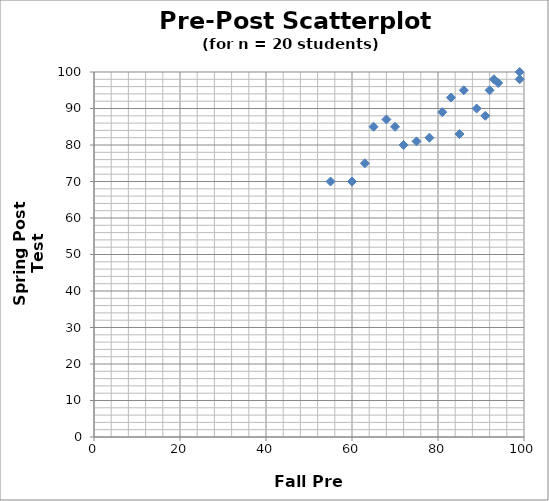
| Category | Pre-Post |
|---|---|
| 86.0 | 95 |
| 70.0 | 85 |
| 63.0 | 75 |
| 72.0 | 80 |
| 94.0 | 97 |
| 93.0 | 98 |
| 81.0 | 89 |
| 60.0 | 70 |
| 99.0 | 98 |
| 78.0 | 82 |
| 99.0 | 100 |
| 83.0 | 93 |
| 89.0 | 90 |
| 85.0 | 83 |
| 75.0 | 81 |
| 55.0 | 70 |
| 65.0 | 85 |
| 92.0 | 95 |
| 91.0 | 88 |
| 68.0 | 87 |